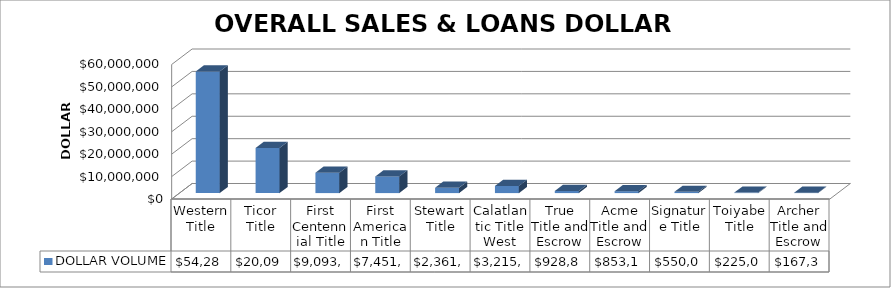
| Category | DOLLAR VOLUME |
|---|---|
| Western Title | 54284396.06 |
| Ticor Title | 20097117 |
| First Centennial Title | 9093976 |
| First American Title | 7451591 |
| Stewart Title | 2361884 |
| Calatlantic Title West | 3215266 |
| True Title and Escrow | 928800 |
| Acme Title and Escrow | 853127 |
| Signature Title | 550000 |
| Toiyabe Title | 225000 |
| Archer Title and Escrow | 167359 |